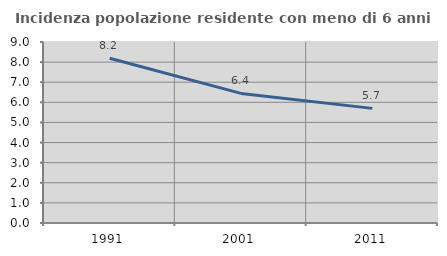
| Category | Incidenza popolazione residente con meno di 6 anni |
|---|---|
| 1991.0 | 8.19 |
| 2001.0 | 6.444 |
| 2011.0 | 5.699 |